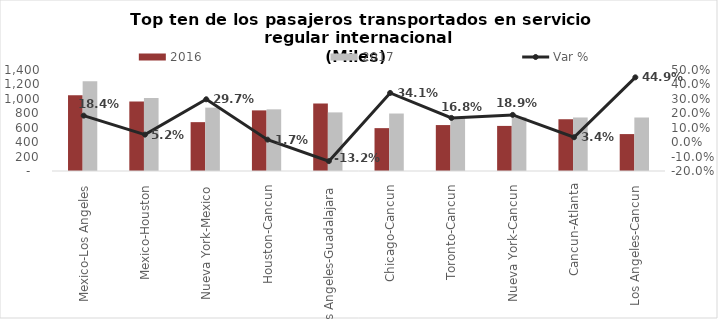
| Category | 2016 | 2017 |
|---|---|---|
| Mexico-Los Angeles | 1050.154 | 1243.187 |
| Mexico-Houston | 962.618 | 1012.793 |
| Nueva York-Mexico | 677.143 | 878.274 |
| Houston-Cancun | 840.26 | 854.905 |
| Los Angeles-Guadalajara | 935.5 | 812.401 |
| Chicago-Cancun | 594.185 | 796.821 |
| Toronto-Cancun | 636.693 | 743.577 |
| Nueva York-Cancun | 625.064 | 743.107 |
| Cancun-Atlanta | 717.481 | 741.82 |
| Los Angeles-Cancun | 511.748 | 741.587 |